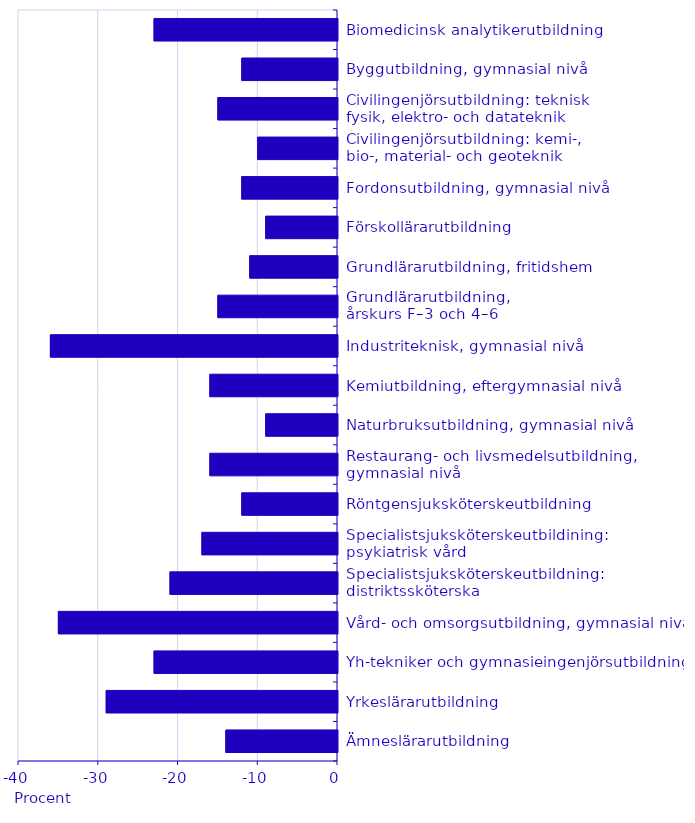
| Category | Skillnaden mellan tillgång och efterfrågan år 2035 som andel av efterfrågan |
|---|---|
| Ämneslärarutbildning | -14 |
| Yrkeslärarutbildning | -29 |
| Yh-tekniker och gymnasieingenjörsutbildning | -23 |
| Vård- och omsorgsutbildning, gymnasial nivå | -35 |
| Specialistsjuksköterskeutbildning: distriktssköterska | -21 |
| Specialistsjuksköterskeutbildining: 
psykiatrisk vård | -17 |
| Röntgensjuksköterskeutbildning | -12 |
| Restaurang- och livsmedelsutbildning, 
gymnasial nivå | -16 |
| Naturbruksutbildning, gymnasial nivå | -9 |
| Kemiutbildning, eftergymnasial nivå | -16 |
| Industriteknisk, gymnasial nivå | -36 |
| Grundlärarutbildning, 
årskurs F–3 och 4–6 | -15 |
| Grundlärarutbildning, fritidshem | -11 |
| Förskollärarutbildning | -9 |
| Fordonsutbildning, gymnasial nivå | -12 |
| Civilingenjörsutbildning: kemi-, 
bio-, material- och geoteknik | -10 |
| Civilingenjörsutbildning: teknisk 
fysik, elektro- och datateknik | -15 |
| Byggutbildning, gymnasial nivå | -12 |
| Biomedicinsk analytikerutbildning | -23 |